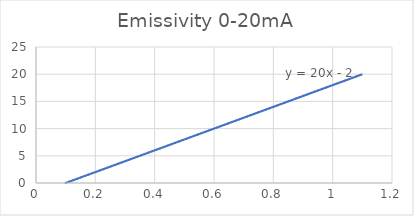
| Category | Series 0 |
|---|---|
| 0.1 | 0 |
| 1.1 | 20 |